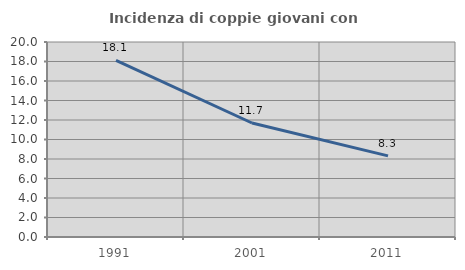
| Category | Incidenza di coppie giovani con figli |
|---|---|
| 1991.0 | 18.114 |
| 2001.0 | 11.694 |
| 2011.0 | 8.324 |